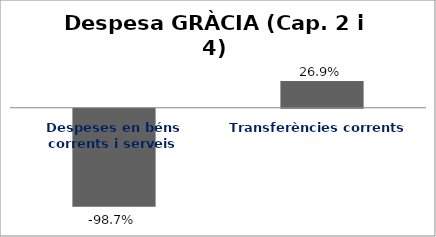
| Category | Series 0 |
|---|---|
| Despeses en béns corrents i serveis | -0.987 |
| Transferències corrents | 0.269 |